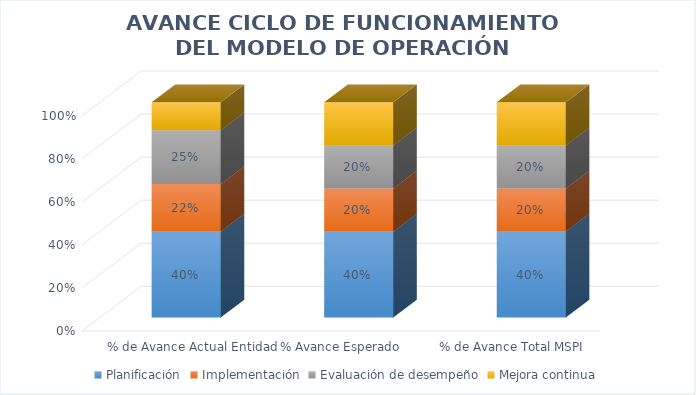
| Category | Planificación | Implementación | Evaluación de desempeño | Mejora continua |
|---|---|---|---|---|
| % de Avance Actual Entidad | 0.4 | 0.22 | 0.25 | 0.25 |
| % Avance Esperado | 0.4 | 0.2 | 0.2 | 0.2 |
| % de Avance Total MSPI | 0.4 | 0.2 | 0.2 | 0.2 |